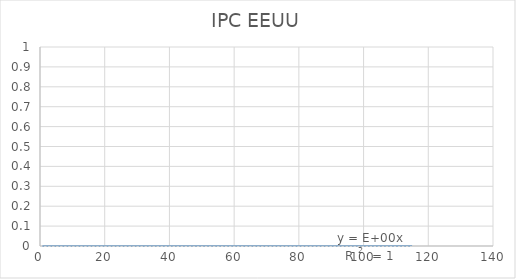
| Category | Series 0 |
|---|---|
| 1.0 | 211.143 |
| 2.0 | 212.193 |
| 3.0 | 212.709 |
| 4.0 | 213.24 |
| 5.0 | 213.856 |
| 6.0 | 215.693 |
| 7.0 | 215.351 |
| 8.0 | 215.834 |
| 9.0 | 215.969 |
| 10.0 | 216.177 |
| 11.0 | 216.33 |
| 12.0 | 215.949 |
| 13.0 | 216.687 |
| 14.0 | 216.741 |
| 15.0 | 217.631 |
| 16.0 | 218.009 |
| 17.0 | 218.178 |
| 18.0 | 217.965 |
| 19.0 | 218.011 |
| 20.0 | 218.312 |
| 21.0 | 218.439 |
| 22.0 | 218.711 |
| 23.0 | 218.803 |
| 24.0 | 219.179 |
| 25.0 | 220.223 |
| 26.0 | 221.309 |
| 27.0 | 223.467 |
| 28.0 | 224.906 |
| 29.0 | 225.964 |
| 30.0 | 225.722 |
| 31.0 | 225.922 |
| 32.0 | 226.545 |
| 33.0 | 226.889 |
| 34.0 | 226.421 |
| 35.0 | 226.23 |
| 36.0 | 225.672 |
| 37.0 | 226.655 |
| 38.0 | 227.663 |
| 39.0 | 229.392 |
| 40.0 | 230.085 |
| 41.0 | 229.815 |
| 42.0 | 229.478 |
| 43.0 | 229.104 |
| 44.0 | 230.379 |
| 45.0 | 231.407 |
| 46.0 | 231.317 |
| 47.0 | 230.221 |
| 48.0 | 229.601 |
| 49.0 | 230.28 |
| 50.0 | 232.166 |
| 51.0 | 232.773 |
| 52.0 | 232.531 |
| 53.0 | 232.945 |
| 54.0 | 233.504 |
| 55.0 | 233.596 |
| 56.0 | 233.877 |
| 57.0 | 234.149 |
| 58.0 | 233.546 |
| 59.0 | 233.069 |
| 60.0 | 233.049 |
| 61.0 | 233.916 |
| 62.0 | 234.781 |
| 63.0 | 236.293 |
| 64.0 | 237.072 |
| 65.0 | 237.9 |
| 66.0 | 238.343 |
| 67.0 | 238.25 |
| 68.0 | 237.852 |
| 69.0 | 238.031 |
| 70.0 | 237.433 |
| 71.0 | 236.151 |
| 72.0 | 234.812 |
| 73.0 | 233.707 |
| 74.0 | 234.722 |
| 75.0 | 236.119 |
| 76.0 | 236.599 |
| 77.0 | 237.805 |
| 78.0 | 238.638 |
| 79.0 | 238.654 |
| 80.0 | 238.316 |
| 81.0 | 237.945 |
| 82.0 | 237.838 |
| 83.0 | 237.336 |
| 84.0 | 236.525 |
| 85.0 | 236.916 |
| 86.0 | 237.111 |
| 87.0 | 238.132 |
| 88.0 | 239.261 |
| 89.0 | 240.236 |
| 90.0 | 241.038 |
| 91.0 | 240.647 |
| 92.0 | 240.853 |
| 93.0 | 241.428 |
| 94.0 | 241.729 |
| 95.0 | 241.353 |
| 96.0 | 241.432 |
| 97.0 | 242.839 |
| 98.0 | 243.603 |
| 99.0 | 243.801 |
| 100.0 | 244.524 |
| 101.0 | 244.733 |
| 102.0 | 244.955 |
| 103.0 | 244.786 |
| 104.0 | 245.519 |
| 105.0 | 246.819 |
| 106.0 | 246.663 |
| 107.0 | 246.669 |
| 108.0 | 246.524 |
| 109.0 | 247.867 |
| 110.0 | 248.991 |
| 111.0 | 249.554 |
| 112.0 | 250.546 |
| 113.0 | 251.588 |
| 114.0 | 251.989 |
| 115.0 | 252.006 |